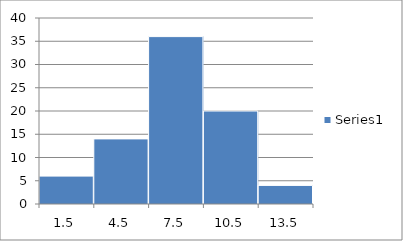
| Category | Series 0 |
|---|---|
| 1.5 | 6 |
| 4.5 | 14 |
| 7.5 | 36 |
| 10.5 | 20 |
| 13.5 | 4 |